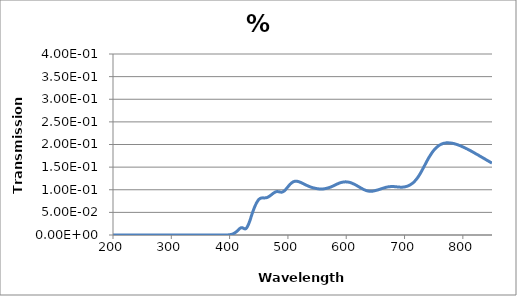
| Category | % Transmission |
|---|---|
| 200.0 | 0 |
| 201.0 | 0 |
| 202.0 | 0 |
| 203.0 | 0 |
| 204.0 | 0 |
| 205.0 | 0 |
| 206.0 | 0 |
| 207.0 | 0 |
| 208.0 | 0 |
| 209.0 | 0 |
| 210.0 | 0 |
| 211.0 | 0 |
| 212.0 | 0 |
| 213.0 | 0 |
| 214.0 | 0 |
| 215.0 | 0 |
| 216.0 | 0 |
| 217.0 | 0 |
| 218.0 | 0 |
| 219.0 | 0 |
| 220.0 | 0 |
| 221.0 | 0 |
| 222.0 | 0 |
| 223.0 | 0 |
| 224.0 | 0 |
| 225.0 | 0 |
| 226.0 | 0 |
| 227.0 | 0 |
| 228.0 | 0 |
| 229.0 | 0 |
| 230.0 | 0 |
| 231.0 | 0 |
| 232.0 | 0 |
| 233.0 | 0 |
| 234.0 | 0 |
| 235.0 | 0 |
| 236.0 | 0 |
| 237.0 | 0 |
| 238.0 | 0 |
| 239.0 | 0 |
| 240.0 | 0 |
| 241.0 | 0 |
| 242.0 | 0 |
| 243.0 | 0 |
| 244.0 | 0 |
| 245.0 | 0 |
| 246.0 | 0 |
| 247.0 | 0 |
| 248.0 | 0 |
| 249.0 | 0 |
| 250.0 | 0 |
| 251.0 | 0 |
| 252.0 | 0 |
| 253.0 | 0 |
| 254.0 | 0 |
| 255.0 | 0 |
| 256.0 | 0 |
| 257.0 | 0 |
| 258.0 | 0 |
| 259.0 | 0 |
| 260.0 | 0 |
| 261.0 | 0 |
| 262.0 | 0 |
| 263.0 | 0 |
| 264.0 | 0 |
| 265.0 | 0 |
| 266.0 | 0 |
| 267.0 | 0 |
| 268.0 | 0 |
| 269.0 | 0 |
| 270.0 | 0 |
| 271.0 | 0 |
| 272.0 | 0 |
| 273.0 | 0 |
| 274.0 | 0 |
| 275.0 | 0 |
| 276.0 | 0 |
| 277.0 | 0 |
| 278.0 | 0 |
| 279.0 | 0 |
| 280.0 | 0 |
| 281.0 | 0 |
| 282.0 | 0 |
| 283.0 | 0 |
| 284.0 | 0 |
| 285.0 | 0 |
| 286.0 | 0 |
| 287.0 | 0 |
| 288.0 | 0 |
| 289.0 | 0 |
| 290.0 | 0 |
| 291.0 | 0 |
| 292.0 | 0 |
| 293.0 | 0 |
| 294.0 | 0 |
| 295.0 | 0 |
| 296.0 | 0 |
| 297.0 | 0 |
| 298.0 | 0 |
| 299.0 | 0 |
| 300.0 | 0 |
| 301.0 | 0 |
| 302.0 | 0 |
| 303.0 | 0 |
| 304.0 | 0 |
| 305.0 | 0 |
| 306.0 | 0 |
| 307.0 | 0 |
| 308.0 | 0 |
| 309.0 | 0 |
| 310.0 | 0 |
| 311.0 | 0 |
| 312.0 | 0 |
| 313.0 | 0 |
| 314.0 | 0 |
| 315.0 | 0 |
| 316.0 | 0 |
| 317.0 | 0 |
| 318.0 | 0 |
| 319.0 | 0 |
| 320.0 | 0 |
| 321.0 | 0 |
| 322.0 | 0 |
| 323.0 | 0 |
| 324.0 | 0 |
| 325.0 | 0 |
| 326.0 | 0 |
| 327.0 | 0 |
| 328.0 | 0 |
| 329.0 | 0 |
| 330.0 | 0 |
| 331.0 | 0 |
| 332.0 | 0 |
| 333.0 | 0 |
| 334.0 | 0 |
| 335.0 | 0 |
| 336.0 | 0 |
| 337.0 | 0 |
| 338.0 | 0 |
| 339.0 | 0 |
| 340.0 | 0 |
| 341.0 | 0 |
| 342.0 | 0 |
| 343.0 | 0 |
| 344.0 | 0 |
| 345.0 | 0 |
| 346.0 | 0 |
| 347.0 | 0 |
| 348.0 | 0 |
| 349.0 | 0 |
| 350.0 | 0 |
| 351.0 | 0 |
| 352.0 | 0 |
| 353.0 | 0 |
| 354.0 | 0 |
| 355.0 | 0 |
| 356.0 | 0 |
| 357.0 | 0 |
| 358.0 | 0 |
| 359.0 | 0 |
| 360.0 | 0 |
| 361.0 | 0 |
| 362.0 | 0 |
| 363.0 | 0 |
| 364.0 | 0 |
| 365.0 | 0 |
| 366.0 | 0 |
| 367.0 | 0 |
| 368.0 | 0 |
| 369.0 | 0 |
| 370.0 | 0 |
| 371.0 | 0 |
| 372.0 | 0 |
| 373.0 | 0 |
| 374.0 | 0 |
| 375.0 | 0 |
| 376.0 | 0 |
| 377.0 | 0 |
| 378.0 | 0 |
| 379.0 | 0 |
| 380.0 | 0 |
| 381.0 | 0 |
| 382.0 | 0 |
| 383.0 | 0 |
| 384.0 | 0 |
| 385.0 | 0 |
| 386.0 | 0 |
| 387.0 | 0 |
| 388.0 | 0 |
| 389.0 | 0 |
| 390.0 | 0 |
| 391.0 | 0 |
| 392.0 | 0 |
| 393.0 | 0 |
| 394.0 | 0 |
| 395.0 | 0 |
| 396.0 | 0 |
| 397.0 | 0 |
| 398.0 | 0 |
| 399.0 | 0 |
| 400.0 | 0.001 |
| 401.0 | 0.001 |
| 402.0 | 0.001 |
| 403.0 | 0.001 |
| 404.0 | 0.002 |
| 405.0 | 0.002 |
| 406.0 | 0.003 |
| 407.0 | 0.003 |
| 408.0 | 0.004 |
| 409.0 | 0.005 |
| 410.0 | 0.006 |
| 411.0 | 0.007 |
| 412.0 | 0.008 |
| 413.0 | 0.009 |
| 414.0 | 0.01 |
| 415.0 | 0.011 |
| 416.0 | 0.013 |
| 417.0 | 0.014 |
| 418.0 | 0.015 |
| 419.0 | 0.016 |
| 420.0 | 0.016 |
| 421.0 | 0.016 |
| 422.0 | 0.016 |
| 423.0 | 0.015 |
| 424.0 | 0.015 |
| 425.0 | 0.014 |
| 426.0 | 0.014 |
| 427.0 | 0.014 |
| 428.0 | 0.014 |
| 429.0 | 0.015 |
| 430.0 | 0.017 |
| 431.0 | 0.02 |
| 432.0 | 0.022 |
| 433.0 | 0.026 |
| 434.0 | 0.029 |
| 435.0 | 0.033 |
| 436.0 | 0.036 |
| 437.0 | 0.041 |
| 438.0 | 0.044 |
| 439.0 | 0.048 |
| 440.0 | 0.052 |
| 441.0 | 0.056 |
| 442.0 | 0.059 |
| 443.0 | 0.062 |
| 444.0 | 0.065 |
| 445.0 | 0.068 |
| 446.0 | 0.07 |
| 447.0 | 0.073 |
| 448.0 | 0.075 |
| 449.0 | 0.077 |
| 450.0 | 0.078 |
| 451.0 | 0.079 |
| 452.0 | 0.08 |
| 453.0 | 0.081 |
| 454.0 | 0.082 |
| 455.0 | 0.082 |
| 456.0 | 0.082 |
| 457.0 | 0.082 |
| 458.0 | 0.082 |
| 459.0 | 0.082 |
| 460.0 | 0.082 |
| 461.0 | 0.082 |
| 462.0 | 0.082 |
| 463.0 | 0.082 |
| 464.0 | 0.083 |
| 465.0 | 0.083 |
| 466.0 | 0.084 |
| 467.0 | 0.085 |
| 468.0 | 0.085 |
| 469.0 | 0.086 |
| 470.0 | 0.087 |
| 471.0 | 0.088 |
| 472.0 | 0.089 |
| 473.0 | 0.09 |
| 474.0 | 0.091 |
| 475.0 | 0.092 |
| 476.0 | 0.093 |
| 477.0 | 0.094 |
| 478.0 | 0.095 |
| 479.0 | 0.095 |
| 480.0 | 0.096 |
| 481.0 | 0.096 |
| 482.0 | 0.096 |
| 483.0 | 0.096 |
| 484.0 | 0.096 |
| 485.0 | 0.096 |
| 486.0 | 0.095 |
| 487.0 | 0.095 |
| 488.0 | 0.095 |
| 489.0 | 0.095 |
| 490.0 | 0.095 |
| 491.0 | 0.095 |
| 492.0 | 0.096 |
| 493.0 | 0.097 |
| 494.0 | 0.098 |
| 495.0 | 0.099 |
| 496.0 | 0.1 |
| 497.0 | 0.102 |
| 498.0 | 0.103 |
| 499.0 | 0.105 |
| 500.0 | 0.107 |
| 501.0 | 0.108 |
| 502.0 | 0.11 |
| 503.0 | 0.111 |
| 504.0 | 0.112 |
| 505.0 | 0.114 |
| 506.0 | 0.115 |
| 507.0 | 0.116 |
| 508.0 | 0.117 |
| 509.0 | 0.117 |
| 510.0 | 0.118 |
| 511.0 | 0.118 |
| 512.0 | 0.119 |
| 513.0 | 0.119 |
| 514.0 | 0.119 |
| 515.0 | 0.119 |
| 516.0 | 0.119 |
| 517.0 | 0.118 |
| 518.0 | 0.118 |
| 519.0 | 0.118 |
| 520.0 | 0.117 |
| 521.0 | 0.117 |
| 522.0 | 0.116 |
| 523.0 | 0.115 |
| 524.0 | 0.115 |
| 525.0 | 0.114 |
| 526.0 | 0.114 |
| 527.0 | 0.113 |
| 528.0 | 0.112 |
| 529.0 | 0.112 |
| 530.0 | 0.111 |
| 531.0 | 0.11 |
| 532.0 | 0.11 |
| 533.0 | 0.109 |
| 534.0 | 0.109 |
| 535.0 | 0.108 |
| 536.0 | 0.108 |
| 537.0 | 0.107 |
| 538.0 | 0.106 |
| 539.0 | 0.106 |
| 540.0 | 0.106 |
| 541.0 | 0.105 |
| 542.0 | 0.105 |
| 543.0 | 0.104 |
| 544.0 | 0.104 |
| 545.0 | 0.104 |
| 546.0 | 0.104 |
| 547.0 | 0.103 |
| 548.0 | 0.103 |
| 549.0 | 0.103 |
| 550.0 | 0.102 |
| 551.0 | 0.102 |
| 552.0 | 0.102 |
| 553.0 | 0.102 |
| 554.0 | 0.102 |
| 555.0 | 0.102 |
| 556.0 | 0.102 |
| 557.0 | 0.102 |
| 558.0 | 0.102 |
| 559.0 | 0.102 |
| 560.0 | 0.102 |
| 561.0 | 0.102 |
| 562.0 | 0.102 |
| 563.0 | 0.102 |
| 564.0 | 0.103 |
| 565.0 | 0.103 |
| 566.0 | 0.103 |
| 567.0 | 0.103 |
| 568.0 | 0.104 |
| 569.0 | 0.104 |
| 570.0 | 0.105 |
| 571.0 | 0.105 |
| 572.0 | 0.105 |
| 573.0 | 0.106 |
| 574.0 | 0.106 |
| 575.0 | 0.107 |
| 576.0 | 0.107 |
| 577.0 | 0.108 |
| 578.0 | 0.109 |
| 579.0 | 0.109 |
| 580.0 | 0.11 |
| 581.0 | 0.111 |
| 582.0 | 0.111 |
| 583.0 | 0.112 |
| 584.0 | 0.112 |
| 585.0 | 0.113 |
| 586.0 | 0.114 |
| 587.0 | 0.114 |
| 588.0 | 0.115 |
| 589.0 | 0.115 |
| 590.0 | 0.116 |
| 591.0 | 0.116 |
| 592.0 | 0.116 |
| 593.0 | 0.117 |
| 594.0 | 0.117 |
| 595.0 | 0.117 |
| 596.0 | 0.117 |
| 597.0 | 0.117 |
| 598.0 | 0.117 |
| 599.0 | 0.117 |
| 600.0 | 0.117 |
| 601.0 | 0.117 |
| 602.0 | 0.117 |
| 603.0 | 0.117 |
| 604.0 | 0.117 |
| 605.0 | 0.117 |
| 606.0 | 0.116 |
| 607.0 | 0.116 |
| 608.0 | 0.115 |
| 609.0 | 0.115 |
| 610.0 | 0.114 |
| 611.0 | 0.114 |
| 612.0 | 0.113 |
| 613.0 | 0.113 |
| 614.0 | 0.112 |
| 615.0 | 0.111 |
| 616.0 | 0.111 |
| 617.0 | 0.11 |
| 618.0 | 0.109 |
| 619.0 | 0.108 |
| 620.0 | 0.108 |
| 621.0 | 0.107 |
| 622.0 | 0.106 |
| 623.0 | 0.105 |
| 624.0 | 0.105 |
| 625.0 | 0.104 |
| 626.0 | 0.103 |
| 627.0 | 0.103 |
| 628.0 | 0.102 |
| 629.0 | 0.101 |
| 630.0 | 0.101 |
| 631.0 | 0.1 |
| 632.0 | 0.099 |
| 633.0 | 0.099 |
| 634.0 | 0.098 |
| 635.0 | 0.098 |
| 636.0 | 0.098 |
| 637.0 | 0.097 |
| 638.0 | 0.097 |
| 639.0 | 0.097 |
| 640.0 | 0.097 |
| 641.0 | 0.097 |
| 642.0 | 0.096 |
| 643.0 | 0.097 |
| 644.0 | 0.097 |
| 645.0 | 0.097 |
| 646.0 | 0.097 |
| 647.0 | 0.097 |
| 648.0 | 0.098 |
| 649.0 | 0.098 |
| 650.0 | 0.098 |
| 651.0 | 0.099 |
| 652.0 | 0.099 |
| 653.0 | 0.099 |
| 654.0 | 0.1 |
| 655.0 | 0.1 |
| 656.0 | 0.1 |
| 657.0 | 0.101 |
| 658.0 | 0.101 |
| 659.0 | 0.102 |
| 660.0 | 0.102 |
| 661.0 | 0.102 |
| 662.0 | 0.103 |
| 663.0 | 0.103 |
| 664.0 | 0.104 |
| 665.0 | 0.104 |
| 666.0 | 0.104 |
| 667.0 | 0.105 |
| 668.0 | 0.105 |
| 669.0 | 0.106 |
| 670.0 | 0.106 |
| 671.0 | 0.106 |
| 672.0 | 0.106 |
| 673.0 | 0.107 |
| 674.0 | 0.107 |
| 675.0 | 0.107 |
| 676.0 | 0.107 |
| 677.0 | 0.107 |
| 678.0 | 0.107 |
| 679.0 | 0.107 |
| 680.0 | 0.107 |
| 681.0 | 0.107 |
| 682.0 | 0.107 |
| 683.0 | 0.107 |
| 684.0 | 0.107 |
| 685.0 | 0.107 |
| 686.0 | 0.106 |
| 687.0 | 0.106 |
| 688.0 | 0.106 |
| 689.0 | 0.106 |
| 690.0 | 0.106 |
| 691.0 | 0.106 |
| 692.0 | 0.106 |
| 693.0 | 0.106 |
| 694.0 | 0.106 |
| 695.0 | 0.106 |
| 696.0 | 0.106 |
| 697.0 | 0.106 |
| 698.0 | 0.106 |
| 699.0 | 0.106 |
| 700.0 | 0.106 |
| 701.0 | 0.107 |
| 702.0 | 0.107 |
| 703.0 | 0.107 |
| 704.0 | 0.108 |
| 705.0 | 0.108 |
| 706.0 | 0.109 |
| 707.0 | 0.109 |
| 708.0 | 0.11 |
| 709.0 | 0.11 |
| 710.0 | 0.111 |
| 711.0 | 0.112 |
| 712.0 | 0.113 |
| 713.0 | 0.114 |
| 714.0 | 0.115 |
| 715.0 | 0.116 |
| 716.0 | 0.117 |
| 717.0 | 0.118 |
| 718.0 | 0.12 |
| 719.0 | 0.121 |
| 720.0 | 0.123 |
| 721.0 | 0.124 |
| 722.0 | 0.126 |
| 723.0 | 0.128 |
| 724.0 | 0.13 |
| 725.0 | 0.132 |
| 726.0 | 0.134 |
| 727.0 | 0.136 |
| 728.0 | 0.138 |
| 729.0 | 0.14 |
| 730.0 | 0.143 |
| 731.0 | 0.145 |
| 732.0 | 0.148 |
| 733.0 | 0.15 |
| 734.0 | 0.153 |
| 735.0 | 0.155 |
| 736.0 | 0.157 |
| 737.0 | 0.16 |
| 738.0 | 0.162 |
| 739.0 | 0.165 |
| 740.0 | 0.167 |
| 741.0 | 0.169 |
| 742.0 | 0.172 |
| 743.0 | 0.174 |
| 744.0 | 0.176 |
| 745.0 | 0.178 |
| 746.0 | 0.18 |
| 747.0 | 0.182 |
| 748.0 | 0.184 |
| 749.0 | 0.185 |
| 750.0 | 0.187 |
| 751.0 | 0.188 |
| 752.0 | 0.19 |
| 753.0 | 0.191 |
| 754.0 | 0.192 |
| 755.0 | 0.194 |
| 756.0 | 0.195 |
| 757.0 | 0.196 |
| 758.0 | 0.197 |
| 759.0 | 0.198 |
| 760.0 | 0.199 |
| 761.0 | 0.199 |
| 762.0 | 0.2 |
| 763.0 | 0.201 |
| 764.0 | 0.201 |
| 765.0 | 0.202 |
| 766.0 | 0.202 |
| 767.0 | 0.203 |
| 768.0 | 0.203 |
| 769.0 | 0.203 |
| 770.0 | 0.203 |
| 771.0 | 0.204 |
| 772.0 | 0.204 |
| 773.0 | 0.204 |
| 774.0 | 0.204 |
| 775.0 | 0.204 |
| 776.0 | 0.204 |
| 777.0 | 0.204 |
| 778.0 | 0.203 |
| 779.0 | 0.203 |
| 780.0 | 0.203 |
| 781.0 | 0.203 |
| 782.0 | 0.203 |
| 783.0 | 0.203 |
| 784.0 | 0.202 |
| 785.0 | 0.202 |
| 786.0 | 0.201 |
| 787.0 | 0.201 |
| 788.0 | 0.201 |
| 789.0 | 0.2 |
| 790.0 | 0.2 |
| 791.0 | 0.199 |
| 792.0 | 0.199 |
| 793.0 | 0.198 |
| 794.0 | 0.198 |
| 795.0 | 0.198 |
| 796.0 | 0.197 |
| 797.0 | 0.196 |
| 798.0 | 0.196 |
| 799.0 | 0.195 |
| 800.0 | 0.195 |
| 801.0 | 0.194 |
| 802.0 | 0.194 |
| 803.0 | 0.193 |
| 804.0 | 0.192 |
| 805.0 | 0.192 |
| 806.0 | 0.191 |
| 807.0 | 0.19 |
| 808.0 | 0.19 |
| 809.0 | 0.189 |
| 810.0 | 0.188 |
| 811.0 | 0.188 |
| 812.0 | 0.187 |
| 813.0 | 0.186 |
| 814.0 | 0.186 |
| 815.0 | 0.185 |
| 816.0 | 0.184 |
| 817.0 | 0.183 |
| 818.0 | 0.183 |
| 819.0 | 0.182 |
| 820.0 | 0.181 |
| 821.0 | 0.181 |
| 822.0 | 0.18 |
| 823.0 | 0.179 |
| 824.0 | 0.178 |
| 825.0 | 0.178 |
| 826.0 | 0.177 |
| 827.0 | 0.176 |
| 828.0 | 0.175 |
| 829.0 | 0.174 |
| 830.0 | 0.174 |
| 831.0 | 0.173 |
| 832.0 | 0.172 |
| 833.0 | 0.172 |
| 834.0 | 0.171 |
| 835.0 | 0.17 |
| 836.0 | 0.169 |
| 837.0 | 0.169 |
| 838.0 | 0.168 |
| 839.0 | 0.167 |
| 840.0 | 0.166 |
| 841.0 | 0.165 |
| 842.0 | 0.165 |
| 843.0 | 0.164 |
| 844.0 | 0.163 |
| 845.0 | 0.162 |
| 846.0 | 0.162 |
| 847.0 | 0.161 |
| 848.0 | 0.16 |
| 849.0 | 0.16 |
| 850.0 | 0.159 |